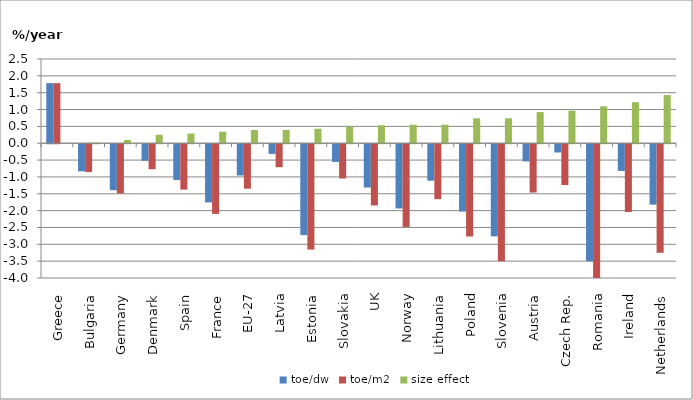
| Category | toe/dw | toe/m2 | size effect |
|---|---|---|---|
| Greece | 1.783 | 1.783 | 0 |
| Bulgaria | -0.805 | -0.826 | 0.021 |
| Germany | -1.364 | -1.461 | 0.097 |
| Denmark | -0.491 | -0.742 | 0.251 |
| Spain | -1.06 | -1.347 | 0.287 |
| France | -1.725 | -2.067 | 0.342 |
| EU-27 | -0.928 | -1.32 | 0.392 |
| Latvia | -0.287 | -0.682 | 0.395 |
| Estonia | -2.696 | -3.127 | 0.43 |
| Slovakia | -0.525 | -1.017 | 0.492 |
| UK | -1.284 | -1.817 | 0.533 |
| Norway | -1.907 | -2.454 | 0.548 |
| Lithuania | -1.082 | -1.63 | 0.549 |
| Poland | -1.999 | -2.738 | 0.739 |
| Slovenia | -2.734 | -3.474 | 0.74 |
| Austria | -0.509 | -1.433 | 0.924 |
| Czech Rep. | -0.246 | -1.211 | 0.965 |
| Romania | -3.474 | -4.57 | 1.096 |
| Ireland | -0.793 | -2.011 | 1.219 |
| Netherlands | -1.793 | -3.223 | 1.43 |